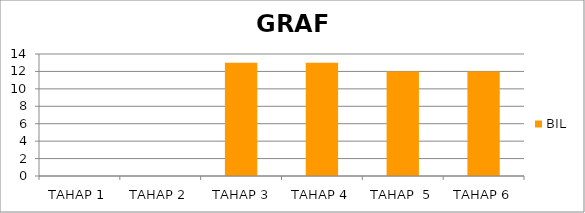
| Category | BIL |
|---|---|
| TAHAP 1 | 0 |
| TAHAP 2 | 0 |
|  TAHAP 3 | 13 |
| TAHAP 4 | 13 |
| TAHAP  5 | 12 |
| TAHAP 6 | 12 |